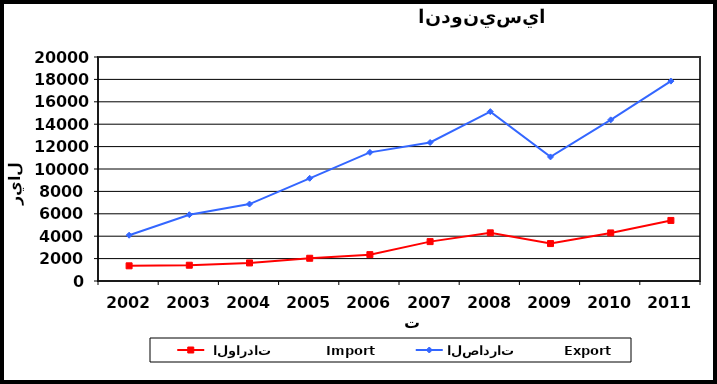
| Category |  الواردات           Import | الصادرات          Export |
|---|---|---|
| 2002.0 | 1355 | 4088 |
| 2003.0 | 1408 | 5917 |
| 2004.0 | 1614 | 6871 |
| 2005.0 | 2030 | 9170 |
| 2006.0 | 2354 | 11484 |
| 2007.0 | 3516 | 12366 |
| 2008.0 | 4301 | 15122 |
| 2009.0 | 3342 | 11079 |
| 2010.0 | 4291 | 14388 |
| 2011.0 | 5407 | 17847 |